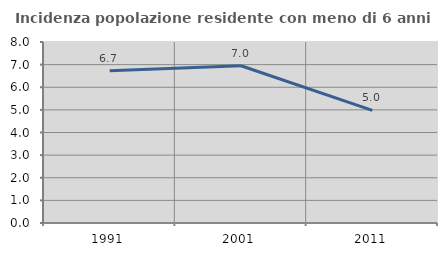
| Category | Incidenza popolazione residente con meno di 6 anni |
|---|---|
| 1991.0 | 6.726 |
| 2001.0 | 6.95 |
| 2011.0 | 4.978 |